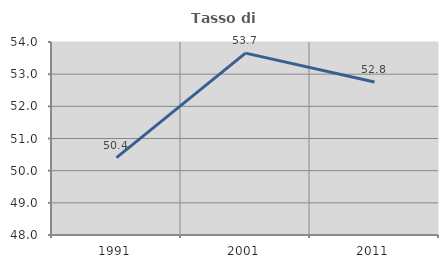
| Category | Tasso di occupazione   |
|---|---|
| 1991.0 | 50.403 |
| 2001.0 | 53.655 |
| 2011.0 | 52.757 |